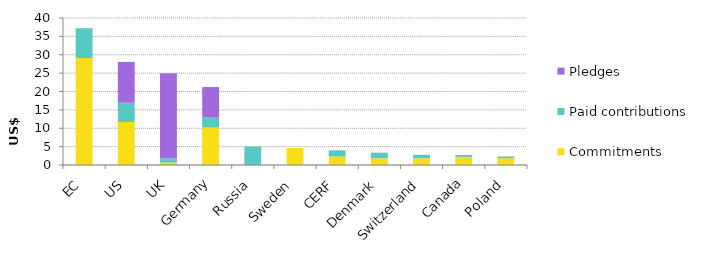
| Category | Commitments | Paid contributions | Pledges |
|---|---|---|---|
| EC | 29.123 | 8.096 | 0 |
| US | 11.718 | 5.225 | 11.1 |
| UK | 0.651 | 1.182 | 23.148 |
| Germany | 10.202 | 2.847 | 8.163 |
| Russia | 0 | 5 | 0 |
| Sweden | 4.643 | 0 | 0 |
| CERF | 2.307 | 1.668 | 0 |
| Denmark | 1.846 | 1.523 | 0 |
| Switzerland | 1.834 | 0.953 | 0 |
| Canada | 2.21 | 0.536 | 0 |
| Poland | 1.852 | 0.468 | 0 |